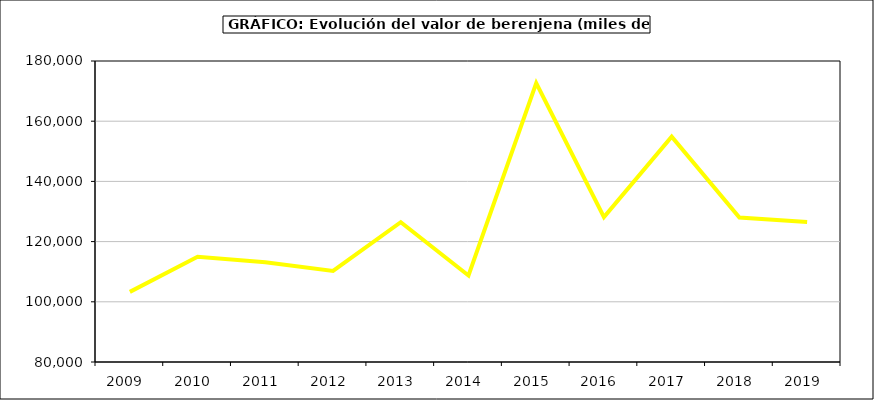
| Category | Valor |
|---|---|
| 2009.0 | 103302.87 |
| 2010.0 | 114934.838 |
| 2011.0 | 113149.264 |
| 2012.0 | 110271.616 |
| 2013.0 | 126461.496 |
| 2014.0 | 108753.977 |
| 2015.0 | 172694 |
| 2016.0 | 128140 |
| 2017.0 | 154840.085 |
| 2018.0 | 127980.525 |
| 2019.0 | 126544.365 |